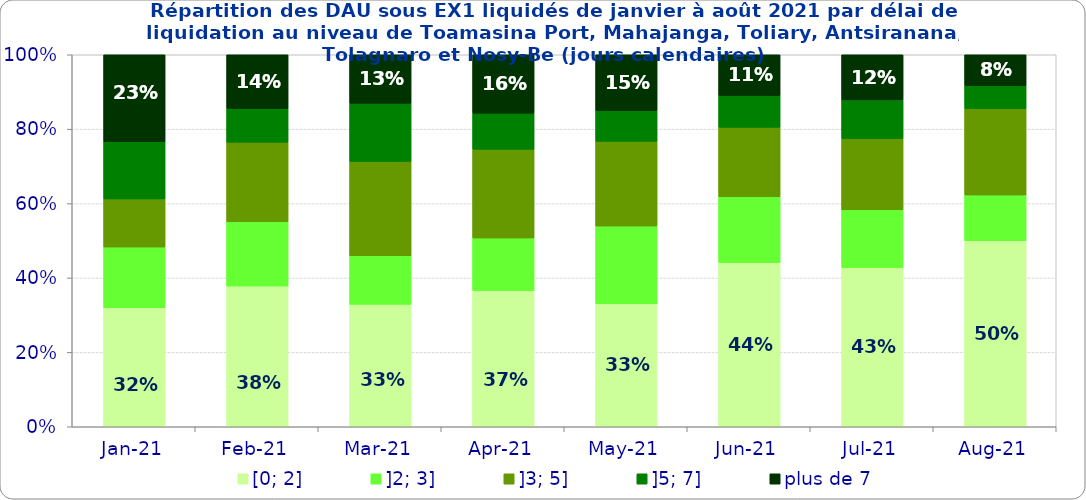
| Category | [0; 2] | ]2; 3] | ]3; 5] | ]5; 7] | plus de 7 |
|---|---|---|---|---|---|
| 2021-01-01 | 0.32 | 0.163 | 0.129 | 0.154 | 0.234 |
| 2021-02-01 | 0.378 | 0.173 | 0.214 | 0.091 | 0.144 |
| 2021-03-01 | 0.329 | 0.13 | 0.253 | 0.157 | 0.13 |
| 2021-04-01 | 0.367 | 0.141 | 0.238 | 0.097 | 0.157 |
| 2021-05-01 | 0.331 | 0.209 | 0.228 | 0.083 | 0.15 |
| 2021-06-01 | 0.441 | 0.177 | 0.187 | 0.086 | 0.11 |
| 2021-07-01 | 0.428 | 0.155 | 0.192 | 0.104 | 0.121 |
| 2021-08-01 | 0.5 | 0.123 | 0.232 | 0.062 | 0.083 |